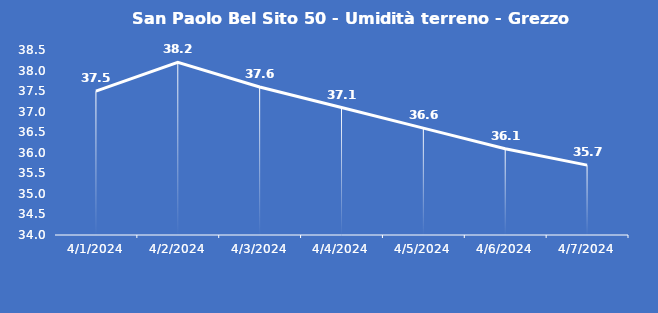
| Category | San Paolo Bel Sito 50 - Umidità terreno - Grezzo (%VWC) |
|---|---|
| 4/1/24 | 37.5 |
| 4/2/24 | 38.2 |
| 4/3/24 | 37.6 |
| 4/4/24 | 37.1 |
| 4/5/24 | 36.6 |
| 4/6/24 | 36.1 |
| 4/7/24 | 35.7 |